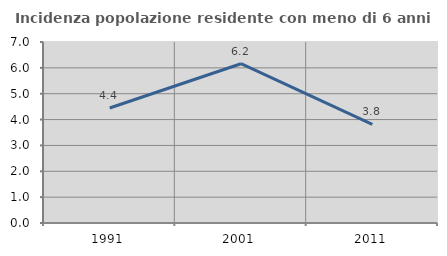
| Category | Incidenza popolazione residente con meno di 6 anni |
|---|---|
| 1991.0 | 4.449 |
| 2001.0 | 6.161 |
| 2011.0 | 3.813 |